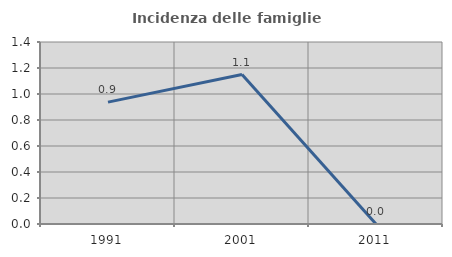
| Category | Incidenza delle famiglie numerose |
|---|---|
| 1991.0 | 0.938 |
| 2001.0 | 1.149 |
| 2011.0 | 0 |